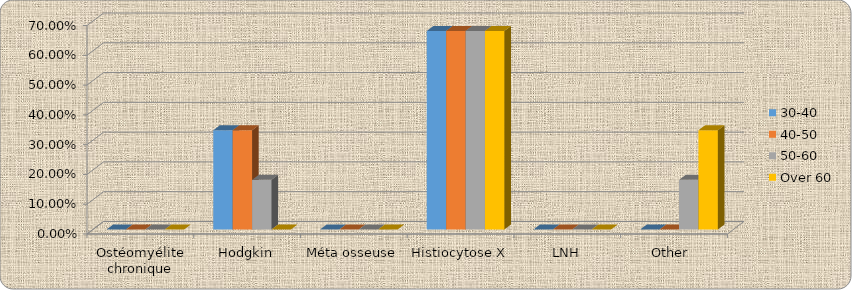
| Category | 30-40 | 40-50 | 50-60 | Over 60 |
|---|---|---|---|---|
| Ostéomyélite chronique | 0 | 0 | 0 | 0 |
| Hodgkin | 0.333 | 0.333 | 0.167 | 0 |
| Méta osseuse | 0 | 0 | 0 | 0 |
| Histiocytose X | 0.667 | 0.667 | 0.667 | 0.667 |
| LNH | 0 | 0 | 0 | 0 |
| Other  | 0 | 0 | 0.167 | 0.333 |